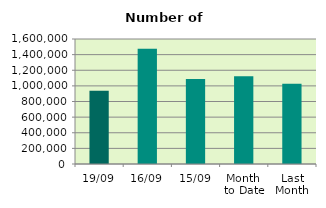
| Category | Series 0 |
|---|---|
| 19/09 | 937154 |
| 16/09 | 1474072 |
| 15/09 | 1087046 |
| Month 
to Date | 1122637.846 |
| Last
Month | 1026775.304 |